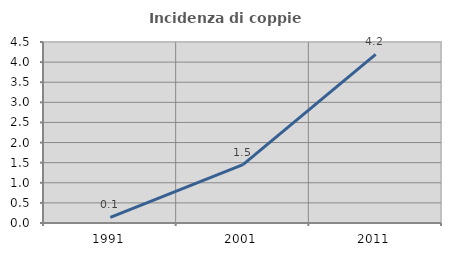
| Category | Incidenza di coppie miste |
|---|---|
| 1991.0 | 0.142 |
| 2001.0 | 1.453 |
| 2011.0 | 4.194 |